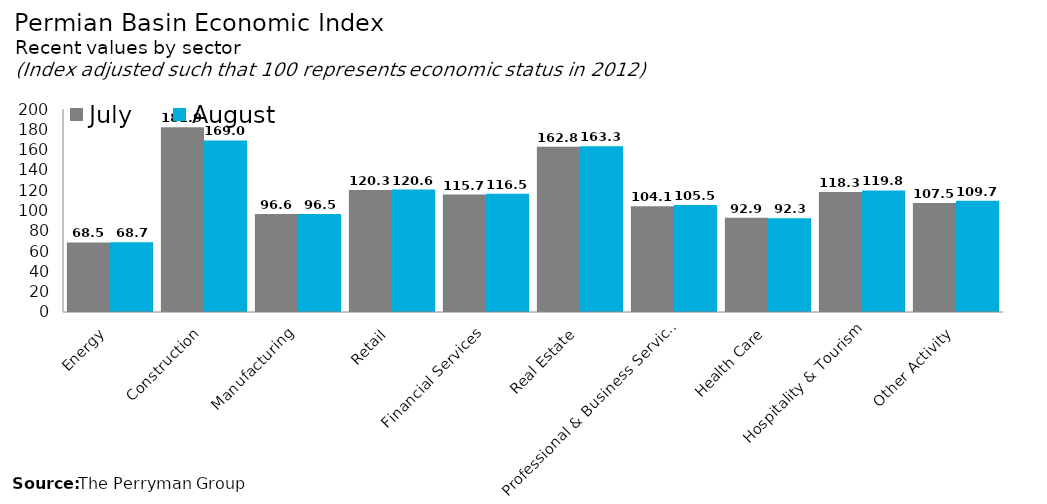
| Category | July | August |
|---|---|---|
| Energy | 68.541 | 68.749 |
| Construction | 181.947 | 169.042 |
| Manufacturing | 96.624 | 96.454 |
| Retail | 120.269 | 120.614 |
| Financial Services | 115.66 | 116.519 |
| Real Estate | 162.75 | 163.337 |
| Professional & Business Services | 104.135 | 105.481 |
| Health Care | 92.919 | 92.348 |
| Hospitality & Tourism | 118.303 | 119.761 |
| Other Activity | 107.506 | 109.682 |